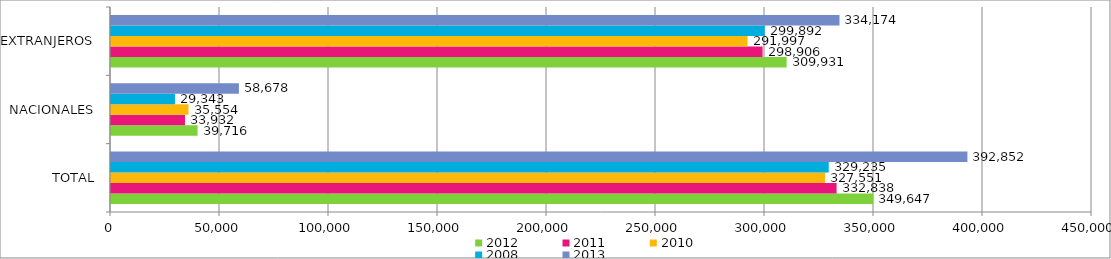
| Category | 2012 | 2011 | 2010 | 2008 | 2013 |
|---|---|---|---|---|---|
| TOTAL | 349647 | 332838 | 327551 | 329235 | 392852 |
| NACIONALES | 39716 | 33932 | 35554 | 29343 | 58678 |
| EXTRANJEROS | 309931 | 298906 | 291997 | 299892 | 334174 |